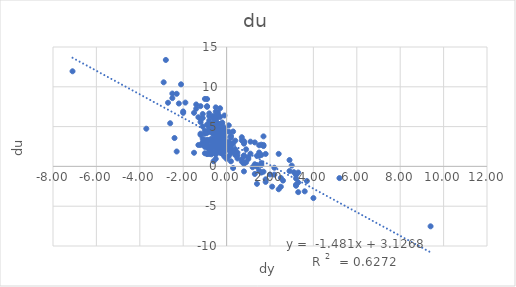
| Category | du |
|---|---|
| 1.0 | 0.943 |
| 2.2 | -1.035 |
| 2.9000000000000004 | -0.583 |
| 3.2 | -1.527 |
| 1.7000000000000002 | 3.773 |
| -0.3000000000000007 | 7.303 |
| -2.1000000000000005 | 10.31 |
| -2.8 | 13.372 |
| -2.9000000000000004 | 10.565 |
| -2.4999999999999996 | 9.15 |
| -1.3999999999999995 | 7.253 |
| -0.8000000000000003 | 5.468 |
| -0.3999999999999999 | 5.165 |
| -0.10000000000000009 | 3.596 |
| 0.0 | 2.237 |
| -0.6000000000000001 | 5.364 |
| -0.3999999999999999 | 6.19 |
| -0.3999999999999999 | 6.782 |
| -0.5 | 5.421 |
| 0.9000000000000004 | 0.524 |
| 2.5999999999999996 | -1.782 |
| 3.1999999999999997 | -2.429 |
| 3.3 | -0.768 |
| 1.5999999999999996 | 2.729 |
| -0.5999999999999996 | 6.17 |
| -1.3999999999999995 | 7.78 |
| -1.9000000000000004 | 8.016 |
| -1.0999999999999996 | 6.579 |
| -0.7000000000000002 | 3.217 |
| -0.20000000000000018 | 2.403 |
| 0.0 | 0.948 |
| -0.10000000000000053 | 1.997 |
| -0.10000000000000009 | 3.05 |
| -0.10000000000000053 | 1.981 |
| 0.10000000000000053 | 3.073 |
| 0.8000000000000007 | 0.355 |
| 2.4 | -2.872 |
| 3.3000000000000007 | -2.02 |
| 3.0999999999999996 | -0.726 |
| 1.5 | 2.657 |
| -0.5 | 7.415 |
| -2.3000000000000007 | 9.119 |
| -2.0 | 6.726 |
| -0.8000000000000007 | 4.585 |
| -0.7000000000000002 | 4.924 |
| 0.10000000000000053 | 2.059 |
| 0.20000000000000018 | 2.488 |
| 0.7000000000000002 | 0.885 |
| 1.7000000000000002 | -0.668 |
| 1.7999999999999998 | 1.566 |
| 1.2999999999999998 | 3.012 |
| -0.09999999999999964 | 6.397 |
| -1.2000000000000002 | 7.569 |
| -1.5 | 6.73 |
| -1.2000000000000002 | 6.007 |
| -0.7000000000000002 | 4.31 |
| 0.20000000000000018 | 3.601 |
| 0.20000000000000018 | 3.825 |
| -0.09999999999999964 | 4.819 |
| 0.09999999999999964 | 5.16 |
| -0.2999999999999998 | 6.217 |
| -0.5 | 6.182 |
| -0.5 | 5.521 |
| -0.5999999999999996 | 5.158 |
| -0.5999999999999996 | 5.478 |
| -0.5 | 5.66 |
| -0.5999999999999996 | 6.347 |
| -0.9000000000000004 | 8.462 |
| -1.0000000000000004 | 8.477 |
| -0.9000000000000004 | 7.489 |
| -0.6000000000000005 | 6.042 |
| -0.39999999999999947 | 4.504 |
| -0.10000000000000009 | 2.925 |
| 0.0 | 2.638 |
| 0.0 | 2.739 |
| 0.19999999999999973 | 2.671 |
| -0.09999999999999964 | 3.845 |
| -0.19999999999999973 | 5.515 |
| -0.2999999999999998 | 5.335 |
| -0.5 | 4.958 |
| -0.30000000000000027 | 4.469 |
| -0.20000000000000018 | 3.065 |
| 0.10000000000000009 | 2.948 |
| 0.20000000000000018 | 2.044 |
| 0.8000000000000003 | 0.323 |
| 1.4 | 0.161 |
| 1.6 | 0.421 |
| 2.1999999999999997 | -0.167 |
| 1.7000000000000002 | 2.697 |
| 1.1000000000000005 | 3.106 |
| 0.7999999999999998 | 3.005 |
| 0.10000000000000053 | 4.366 |
| -0.10000000000000053 | 3.473 |
| -0.20000000000000018 | 5.251 |
| -0.40000000000000036 | 5.378 |
| -0.5 | 6.892 |
| -0.8999999999999995 | 7.561 |
| -0.7999999999999998 | 6.32 |
| -0.7999999999999998 | 4.771 |
| -0.6000000000000005 | 4.024 |
| 0.1999999999999993 | 0.639 |
| 0.2999999999999998 | -0.208 |
| 0.7999999999999998 | -0.629 |
| 1.7999999999999998 | -1.946 |
| 3.200000000000001 | -2.3 |
| 3.7 | -1.835 |
| 2.9000000000000004 | 0.799 |
| 1.700000000000001 | 2.555 |
| -0.6000000000000005 | 6.154 |
| -1.3000000000000007 | 6.174 |
| -0.7999999999999998 | 4.958 |
| -0.5000000000000009 | 4.312 |
| -0.20000000000000018 | 3.227 |
| -0.5 | 4.465 |
| -0.7999999999999998 | 5.77 |
| -1.0999999999999996 | 5.013 |
| -1.2000000000000002 | 4.114 |
| -1.0999999999999996 | 6.078 |
| -0.9000000000000004 | 5.247 |
| -0.7999999999999998 | 6.66 |
| -0.39999999999999947 | 6.51 |
| -0.2999999999999998 | 2.657 |
| -0.09999999999999964 | 2.389 |
| 0.09999999999999964 | 1.284 |
| 0.39999999999999947 | 1.421 |
| 1.5999999999999996 | -0.775 |
| 1.7999999999999998 | -1.624 |
| 1.4000000000000004 | -0.039 |
| 1.1000000000000005 | 1.6 |
| 0.10000000000000053 | 2.969 |
| -0.2999999999999998 | 4.326 |
| 0.7999999999999989 | 1.3 |
| 1.4000000000000004 | -2.191 |
| 2.0 | -1.011 |
| 2.5 | -2.556 |
| 2.5 | -1.443 |
| 1.5999999999999996 | 1.431 |
| 0.6999999999999993 | 3.268 |
| -0.5 | 5.737 |
| -2.1999999999999993 | 7.9 |
| -2.5 | 8.578 |
| -2.6999999999999993 | 7.997 |
| -2.0 | 6.901 |
| -1.2000000000000002 | 5.576 |
| -0.7000000000000002 | 4.555 |
| -0.10000000000000053 | 3.684 |
| -0.20000000000000018 | 4.262 |
| -0.2999999999999998 | 4.182 |
| -0.20000000000000018 | 4.146 |
| -0.09999999999999964 | 3.702 |
| -0.20000000000000018 | 3.119 |
| -0.20000000000000018 | 2.907 |
| -0.40000000000000036 | 2.712 |
| -0.9000000000000004 | 3.354 |
| -1.0 | 3.262 |
| -1.0 | 4.475 |
| -0.8999999999999995 | 4.241 |
| -0.7999999999999998 | 4.484 |
| -0.5 | 4.193 |
| -0.5 | 3.799 |
| -0.5 | 4.315 |
| -0.2999999999999998 | 3.748 |
| -0.2999999999999998 | 3.908 |
| 0.10000000000000053 | 2.743 |
| 0.09999999999999964 | 2.821 |
| 0.09999999999999964 | 2.413 |
| 0.5 | 1.727 |
| 0.6999999999999993 | 0.603 |
| 1.2999999999999998 | -0.95 |
| 1.5 | -0.539 |
| 1.2000000000000002 | -0.103 |
| 1.0 | 1.166 |
| 0.8000000000000007 | 2.859 |
| 0.7999999999999998 | 3.17 |
| 0.6999999999999993 | 3.665 |
| 0.3000000000000007 | 4.383 |
| -0.3000000000000007 | 3.32 |
| -0.5 | 2.807 |
| -0.7999999999999998 | 2.287 |
| -0.8000000000000007 | 2.608 |
| -0.5 | 3.431 |
| -0.8999999999999995 | 4.226 |
| -0.7999999999999998 | 4.337 |
| -1.0 | 4.116 |
| -1.0999999999999996 | 3.481 |
| -0.5 | 2.402 |
| -0.2999999999999998 | 2.673 |
| 0.0 | 2.2 |
| 0.0 | 2.601 |
| -0.20000000000000018 | 4.002 |
| -0.40000000000000036 | 4.05 |
| -0.2999999999999998 | 4.421 |
| -0.2999999999999998 | 4.314 |
| -0.5 | 4.311 |
| -0.39999999999999947 | 4.675 |
| -0.5999999999999996 | 4.484 |
| -0.6000000000000005 | 4.856 |
| -0.5999999999999996 | 4.093 |
| -0.40000000000000036 | 4.103 |
| -0.2999999999999998 | 4.883 |
| -0.2999999999999998 | 4.816 |
| -0.10000000000000053 | 4.722 |
| -0.2999999999999998 | 4.791 |
| -0.3000000000000007 | 4.824 |
| -0.2999999999999998 | 4.225 |
| -0.3999999999999999 | 5.244 |
| -0.20000000000000018 | 3.973 |
| -0.19999999999999973 | 2.906 |
| 0.20000000000000018 | 2.198 |
| 0.5000000000000004 | 0.996 |
| 0.7999999999999998 | 0.489 |
| 1.6 | 0.167 |
| 1.5 | 1.337 |
| 1.3999999999999995 | 1.325 |
| 0.9000000000000004 | 2.147 |
| 0.40000000000000036 | 1.993 |
| 0.20000000000000018 | 1.679 |
| 0.2999999999999998 | 1.955 |
| 0.39999999999999947 | 3.231 |
| -0.10000000000000053 | 4.3 |
| -0.20000000000000018 | 4.342 |
| -0.5 | 4.227 |
| -0.6999999999999993 | 3.495 |
| -0.39999999999999947 | 3.351 |
| -0.40000000000000036 | 3.909 |
| -0.5 | 3.618 |
| -0.40000000000000036 | 3.449 |
| -0.40000000000000036 | 2.973 |
| -0.5999999999999996 | 3.213 |
| -0.5 | 2.973 |
| -0.40000000000000036 | 2.325 |
| -0.5999999999999996 | 2.635 |
| -0.20000000000000018 | 1.577 |
| -0.09999999999999964 | 1.934 |
| 0.10000000000000053 | 2.368 |
| 0.39999999999999947 | 2.133 |
| 0.5 | 1.392 |
| 0.7999999999999998 | 1.376 |
| 1.2999999999999998 | 0.266 |
| 2.1000000000000005 | -2.541 |
| 3.3000000000000007 | -3.234 |
| 4.000000000000001 | -3.979 |
| 3.5999999999999996 | -3.133 |
| 3.0 | 0.106 |
| 1.5 | 1.745 |
| 0.29999999999999893 | 2.914 |
| -0.09999999999999964 | 3.344 |
| -0.40000000000000036 | 2.776 |
| -0.8000000000000007 | 2.038 |
| -0.5 | 1.744 |
| -0.5 | 0.943 |
| -0.9000000000000004 | 1.543 |
| -0.6999999999999993 | 2.638 |
| -0.9000000000000004 | 2.403 |
| -1.0 | 2.574 |
| -0.7999999999999998 | 1.552 |
| -0.6000000000000005 | 1.701 |
| -0.6999999999999993 | 1.52 |
| -0.7999999999999998 | 2.237 |
| -0.8999999999999995 | 3.009 |
| -1.0 | 1.651 |
| -1.2999999999999998 | 2.689 |
| -1.1000000000000005 | 3.06 |
| -1.2000000000000002 | 2.686 |
| -1.2000000000000002 | 3.969 |
| -0.7999999999999998 | 3.279 |
| -1.0 | 2.447 |
| -0.7000000000000002 | 2.12 |
| -0.5999999999999996 | 1.795 |
| -0.5 | 1.493 |
| -0.1999999999999993 | 1.806 |
| -0.20000000000000018 | 2.182 |
| -0.3000000000000007 | 2.087 |
| -0.5 | 2.33 |
| -0.6000000000000005 | 2.411 |
| -0.5999999999999996 | 2.994 |
| -0.5999999999999996 | 3.329 |
| -0.5000000000000004 | 3.299 |
| -0.5 | 3.13 |
| -0.40000000000000036 | 2.125 |
| -0.10000000000000009 | 1.851 |
| -0.2999999999999998 | 2.154 |
| -0.19999999999999973 | 2.67 |
| -0.19999999999999973 | 3.183 |
| -0.10000000000000009 | 1.227 |
| 9.4 | -7.528 |
| 5.200000000000001 | -1.469 |
| 3.1999999999999997 | -1.083 |
| 2.4000000000000004 | 1.573 |
| -7.1 | 11.95 |
| -3.700000000000001 | 4.735 |
| -2.5999999999999996 | 5.421 |
| -2.4000000000000004 | 3.565 |
| -2.3000000000000003 | 1.871 |
| -1.4999999999999996 | 1.713 |
| -0.6000000000000001 | 0.652 |
| -0.2999999999999998 | 1.718 |
| 0.0 | 2.382 |